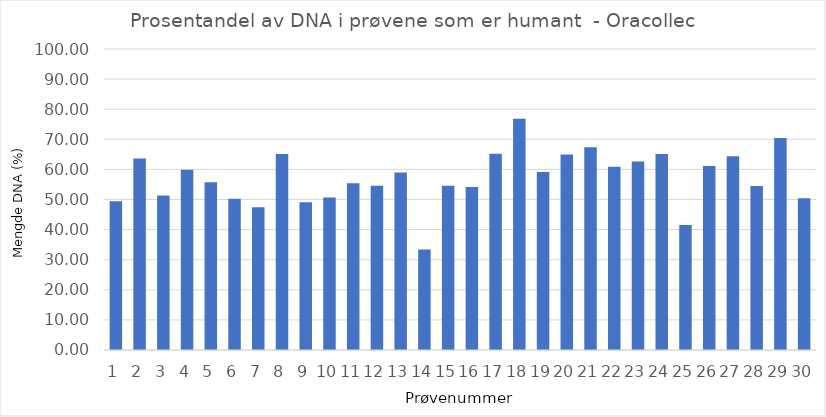
| Category | Humant DNA |
|---|---|
| 0 | 49.425 |
| 1 | 63.615 |
| 2 | 51.295 |
| 3 | 59.85 |
| 4 | 55.755 |
| 5 | 50.227 |
| 6 | 47.444 |
| 7 | 65.121 |
| 8 | 49.052 |
| 9 | 50.639 |
| 10 | 55.44 |
| 11 | 54.533 |
| 12 | 58.987 |
| 13 | 33.35 |
| 14 | 54.586 |
| 15 | 54.164 |
| 16 | 65.185 |
| 17 | 76.818 |
| 18 | 59.148 |
| 19 | 64.972 |
| 20 | 67.394 |
| 21 | 60.894 |
| 22 | 62.666 |
| 23 | 65.122 |
| 24 | 41.5 |
| 25 | 61.12 |
| 26 | 64.396 |
| 27 | 54.468 |
| 28 | 70.394 |
| 29 | 50.448 |